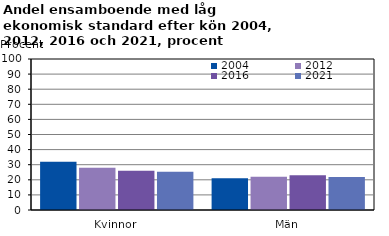
| Category | 2004 | 2012 | 2016 | 2021 |
|---|---|---|---|---|
| Kvinnor | 32 | 28 | 26 | 25.4 |
| Män | 21 | 22 | 23 | 21.8 |